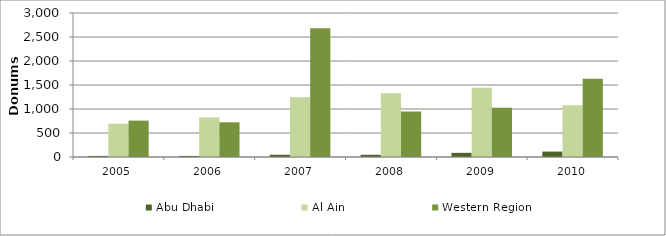
| Category | Abu Dhabi | Al Ain | Western Region |
|---|---|---|---|
| 2005.0 | 22 | 693 | 758 |
| 2006.0 | 22 | 824 | 723 |
| 2007.0 | 46 | 1246 | 2683 |
| 2008.0 | 46 | 1328 | 948 |
| 2009.0 | 87 | 1442.5 | 1024.5 |
| 2010.0 | 113 | 1080 | 1632 |